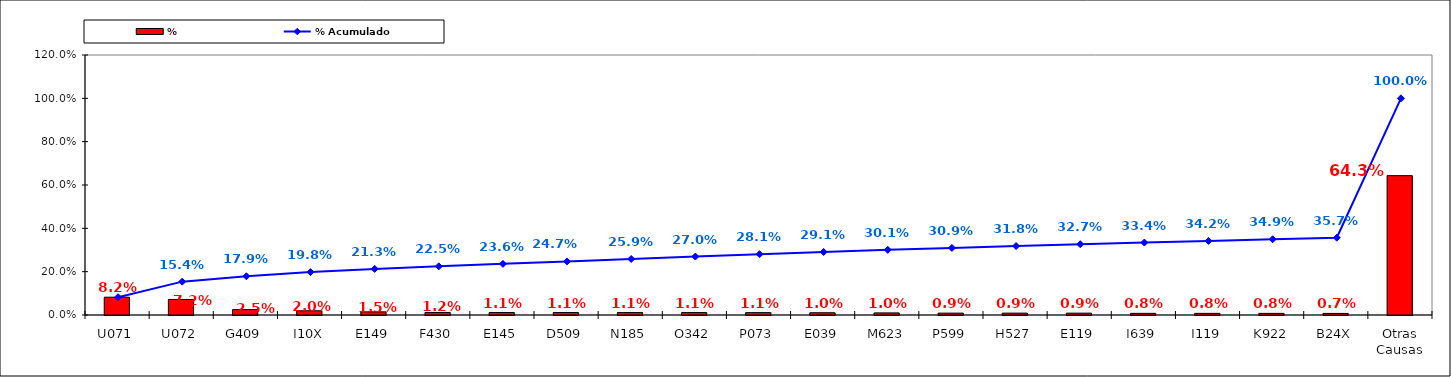
| Category | % |
|---|---|
| U071 | 0.082 |
| U072 | 0.072 |
| G409 | 0.025 |
| I10X | 0.02 |
| E149 | 0.015 |
| F430 | 0.012 |
| E145 | 0.011 |
| D509 | 0.011 |
| N185 | 0.011 |
| O342 | 0.011 |
| P073 | 0.011 |
| E039 | 0.01 |
| M623 | 0.01 |
| P599 | 0.009 |
| H527 | 0.009 |
| E119 | 0.009 |
| I639 | 0.008 |
| I119 | 0.008 |
| K922 | 0.008 |
| B24X | 0.007 |
| Otras Causas | 0.643 |